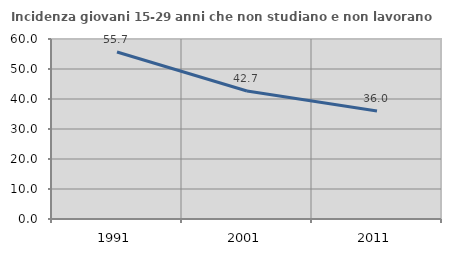
| Category | Incidenza giovani 15-29 anni che non studiano e non lavorano  |
|---|---|
| 1991.0 | 55.682 |
| 2001.0 | 42.672 |
| 2011.0 | 36.013 |